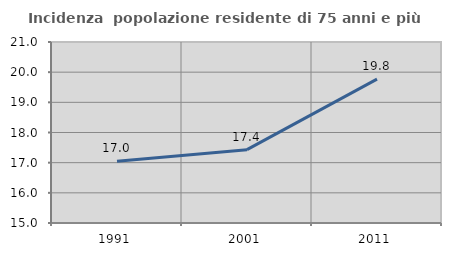
| Category | Incidenza  popolazione residente di 75 anni e più |
|---|---|
| 1991.0 | 17.047 |
| 2001.0 | 17.431 |
| 2011.0 | 19.77 |